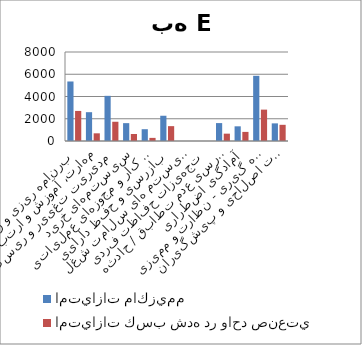
| Category | امتيازات ماكزيمم | امتيازات كسب شده در واحد صنعتي |
|---|---|---|
| برنامه ریزی و رهبری | 5350 | 2702 |
| مهارت، آموزش و ارتباطات | 2590 | 690 |
| مدیریت تغییر و ریسک | 4060 | 1730 |
| سیستمهای خرید | 1605 | 630 |
| قوانین کار و مجوزهای عملیاتی | 1060 | 280 |
| بازرسی و حفظ دارایی | 2270 | 1335 |
| سیستم های سلامت شغلی | 0 | 0 |
| تجهیزات حفاظت فردی | 0 | 0 |
| گزارش و بررسی عدم تطابق / حادثه | 1610 | 660 |
| آمادگی اضطراری | 1320 | 818 |
| اندازه گیری - نظارت و ممیزی | 5860 | 2820 |
| سیستم اقدامات اصلاحی و پیشگیرانه | 1585 | 1455 |